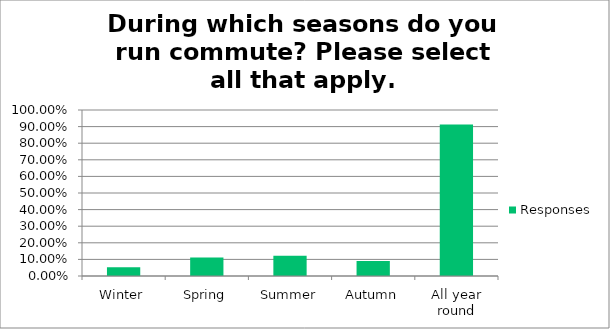
| Category | Responses |
|---|---|
| Winter | 0.052 |
| Spring | 0.112 |
| Summer | 0.122 |
| Autumn | 0.091 |
| All year round | 0.913 |